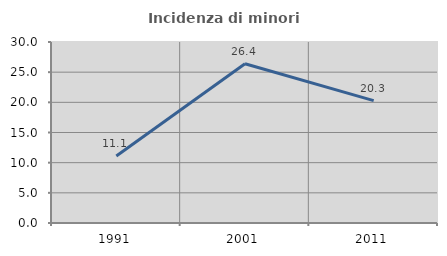
| Category | Incidenza di minori stranieri |
|---|---|
| 1991.0 | 11.111 |
| 2001.0 | 26.389 |
| 2011.0 | 20.28 |